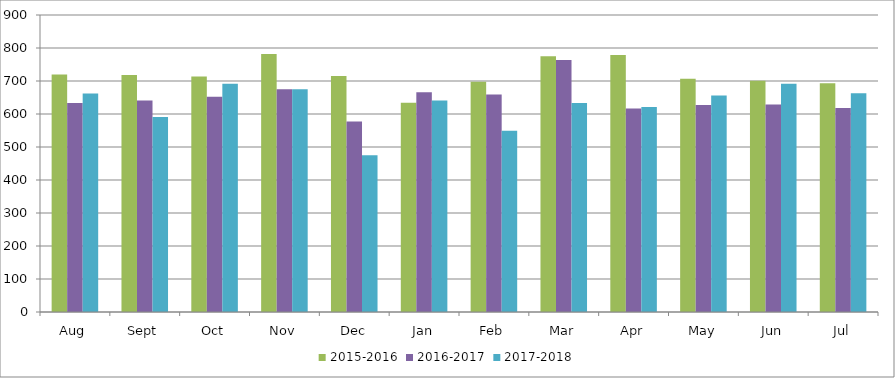
| Category | 2015-2016 | 2016-2017 | 2017-2018 |
|---|---|---|---|
| Aug | 720 | 633 | 662 |
| Sept | 718 | 641 | 591 |
| Oct | 714 | 652 | 692 |
| Nov | 782 | 675 | 675 |
| Dec | 715 | 577 | 475 |
| Jan | 634 | 666 | 641 |
| Feb | 698 | 659 | 549 |
| Mar | 775 | 764 | 633 |
| Apr | 779 | 617 | 621 |
| May | 707 | 627 | 656 |
| Jun | 701 | 629 | 692 |
| Jul | 693 | 618 | 663 |